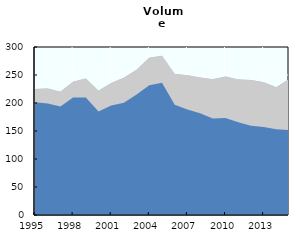
| Category | Inland fisheries | Aquaculture | Marine landings |
|---|---|---|---|
| 1995.0 | 225.158 | 225.158 | 201.149 |
| 1996.0 | 225.681 | 225.681 | 199.33 |
| 1997.0 | 220.291 | 220.291 | 193.654 |
| 1998.0 | 237.999 | 237.999 | 209.66 |
| 1999.0 | 243.921 | 243.921 | 209.799 |
| 2000.0 | 221.748 | 221.748 | 184.753 |
| 2001.0 | 235.681 | 235.681 | 195.7 |
| 2002.0 | 245.241 | 245.241 | 200.49 |
| 2003.0 | 259.512 | 259.512 | 215.187 |
| 2004.0 | 280.974 | 280.974 | 231.69 |
| 2005.0 | 284.314 | 284.314 | 236.151 |
| 2006.0 | 251.579 | 251.579 | 196.928 |
| 2007.0 | 249.652 | 249.652 | 188.41 |
| 2008.0 | 245.638 | 245.638 | 181.51 |
| 2009.0 | 242.571 | 242.571 | 172.449 |
| 2010.0 | 247.186 | 247.186 | 173.357 |
| 2011.0 | 242.074 | 242.074 | 165.799 |
| 2012.0 | 241.169 | 241.169 | 159.336 |
| 2013.0 | 237.212 | 237.212 | 157.151 |
| 2014.0 | 228.136 | 228.136 | 153.104 |
| 2015.0 | 242.476 | 242.476 | 151.439 |